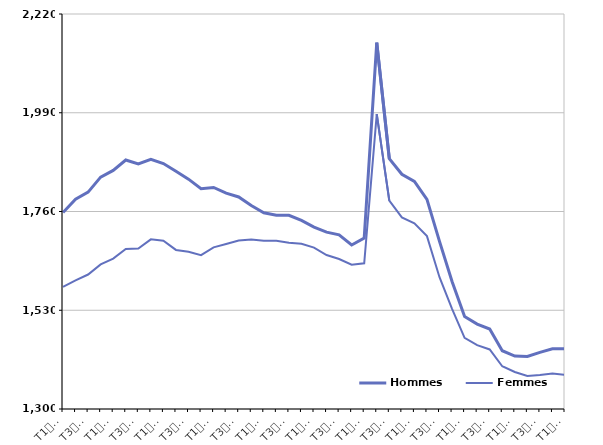
| Category | Hommes  | Femmes  |
|---|---|---|
| T1
2014 | 1757.6 | 1584.5 |
| T2
2014 | 1788.8 | 1599.7 |
| T3
2014 | 1805.1 | 1613.2 |
| T4
2014 | 1840 | 1636.9 |
| T1
2015 | 1855.7 | 1650.4 |
| T2
2015 | 1880 | 1672.5 |
| T3
2015 | 1870.6 | 1673.6 |
| T4
2015 | 1881.6 | 1695.1 |
| T1
2016 | 1871.7 | 1691.9 |
| T2
2016 | 1853.9 | 1670.5 |
| T3
2016 | 1835.3 | 1666.1 |
| T4
2016 | 1813.1 | 1658.3 |
| T1
2017 | 1816 | 1676.5 |
| T2
2017 | 1802.9 | 1684.3 |
| T3
2017 | 1793.9 | 1692.2 |
| T4
2017 | 1773.8 | 1695 |
| T1
2018 | 1757.2 | 1692 |
| T2
2018 | 1751.4 | 1691.8 |
| T3
2018 | 1751.1 | 1687.2 |
| T4
2018 | 1739.2 | 1685 |
| T1
2019 | 1723.8 | 1675.8 |
| T2
2019 | 1712 | 1658.6 |
| T3
2019 | 1705.6 | 1649.4 |
| T4
2019 | 1681.9 | 1636.1 |
| T1
2020 | 1698 | 1639.3 |
| T2
2020 | 2153.2 | 1986.9 |
| T3
2020 | 1883.3 | 1785.3 |
| T4
2020 | 1846.7 | 1746.1 |
| T1
2021 | 1830.2 | 1732.4 |
| T2
2021 | 1788.3 | 1702.6 |
| T3
2021 | 1690.5 | 1606.9 |
| T4
2021 | 1597.1 | 1533.4 |
| T1
2022 | 1515.3 | 1465.7 |
| T2
2022 | 1497.9 | 1448.6 |
| T3
2022 | 1486.3 | 1438.7 |
| T4
2022 | 1435.7 | 1399.6 |
| T1
2023 | 1423.3 | 1386.3 |
| T2
2023 | 1422.2 | 1376.9 |
| T3
2023 | 1432 | 1379.1 |
| T4
2023 | 1440.2 | 1382.8 |
| T1
2024 | 1440.4 | 1379.4 |